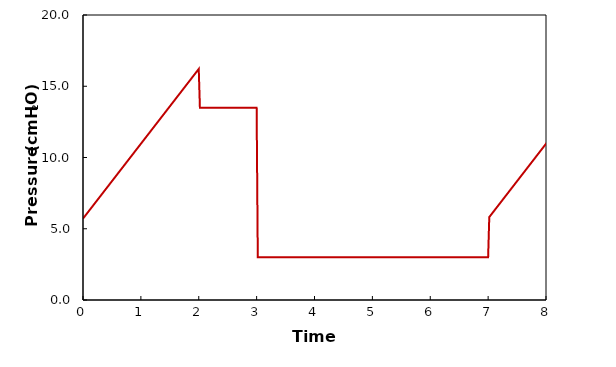
| Category | Poa |
|---|---|
| 0.0 | 5.712 |
| 0.02 | 5.818 |
| 0.04 | 5.922 |
| 0.06 | 6.028 |
| 0.08 | 6.132 |
| 0.1 | 6.238 |
| 0.12 | 6.342 |
| 0.14 | 6.448 |
| 0.16 | 6.552 |
| 0.18 | 6.658 |
| 0.2 | 6.762 |
| 0.22 | 6.868 |
| 0.24 | 6.972 |
| 0.26 | 7.078 |
| 0.28 | 7.182 |
| 0.3 | 7.288 |
| 0.32 | 7.392 |
| 0.34 | 7.498 |
| 0.36 | 7.602 |
| 0.38 | 7.708 |
| 0.4 | 7.812 |
| 0.42 | 7.917 |
| 0.44 | 8.022 |
| 0.46 | 8.127 |
| 0.48 | 8.232 |
| 0.5 | 8.337 |
| 0.52 | 8.442 |
| 0.54 | 8.548 |
| 0.56 | 8.652 |
| 0.58 | 8.758 |
| 0.6 | 8.862 |
| 0.62 | 8.968 |
| 0.64 | 9.072 |
| 0.66 | 9.178 |
| 0.68 | 9.282 |
| 0.7 | 9.388 |
| 0.72 | 9.492 |
| 0.74 | 9.598 |
| 0.76 | 9.702 |
| 0.78 | 9.808 |
| 0.8 | 9.912 |
| 0.82 | 10.017 |
| 0.84 | 10.122 |
| 0.86 | 10.228 |
| 0.88 | 10.332 |
| 0.9 | 10.438 |
| 0.92 | 10.542 |
| 0.94 | 10.647 |
| 0.96 | 10.752 |
| 0.98 | 10.857 |
| 1.0 | 10.962 |
| 1.02 | 11.067 |
| 1.04 | 11.172 |
| 1.06 | 11.278 |
| 1.08 | 11.382 |
| 1.1 | 11.487 |
| 1.12 | 11.592 |
| 1.14 | 11.697 |
| 1.16 | 11.802 |
| 1.18 | 11.907 |
| 1.2 | 12.012 |
| 1.22 | 12.118 |
| 1.24 | 12.222 |
| 1.26 | 12.327 |
| 1.28 | 12.432 |
| 1.3 | 12.538 |
| 1.32 | 12.642 |
| 1.34 | 12.747 |
| 1.36 | 12.852 |
| 1.38 | 12.958 |
| 1.4 | 13.062 |
| 1.42 | 13.167 |
| 1.44 | 13.272 |
| 1.46 | 13.377 |
| 1.48 | 13.482 |
| 1.5 | 13.587 |
| 1.52 | 13.692 |
| 1.54 | 13.798 |
| 1.56 | 13.902 |
| 1.58 | 14.007 |
| 1.6 | 14.112 |
| 1.62 | 14.218 |
| 1.64 | 14.322 |
| 1.66 | 14.427 |
| 1.68 | 14.532 |
| 1.7 | 14.637 |
| 1.72 | 14.742 |
| 1.74 | 14.847 |
| 1.76 | 14.952 |
| 1.78 | 15.058 |
| 1.8 | 15.162 |
| 1.82 | 15.267 |
| 1.84 | 15.372 |
| 1.86 | 15.478 |
| 1.88 | 15.582 |
| 1.9 | 15.687 |
| 1.92 | 15.792 |
| 1.94 | 15.897 |
| 1.96 | 16.002 |
| 1.98 | 16.107 |
| 2.0 | 16.212 |
| 2.02 | 13.5 |
| 2.04 | 13.5 |
| 2.06 | 13.5 |
| 2.08 | 13.5 |
| 2.1 | 13.5 |
| 2.12 | 13.5 |
| 2.14 | 13.5 |
| 2.16 | 13.5 |
| 2.18 | 13.5 |
| 2.2 | 13.5 |
| 2.22 | 13.5 |
| 2.24 | 13.5 |
| 2.26 | 13.5 |
| 2.28 | 13.5 |
| 2.3 | 13.5 |
| 2.32 | 13.5 |
| 2.34 | 13.5 |
| 2.36 | 13.5 |
| 2.38 | 13.5 |
| 2.4 | 13.5 |
| 2.42 | 13.5 |
| 2.44 | 13.5 |
| 2.46 | 13.5 |
| 2.48 | 13.5 |
| 2.5 | 13.5 |
| 2.52 | 13.5 |
| 2.54 | 13.5 |
| 2.56 | 13.5 |
| 2.58 | 13.5 |
| 2.6 | 13.5 |
| 2.62 | 13.5 |
| 2.64 | 13.5 |
| 2.66 | 13.5 |
| 2.68 | 13.5 |
| 2.7 | 13.5 |
| 2.72 | 13.5 |
| 2.74 | 13.5 |
| 2.76 | 13.5 |
| 2.78 | 13.5 |
| 2.8 | 13.5 |
| 2.82 | 13.5 |
| 2.84 | 13.5 |
| 2.86 | 13.5 |
| 2.88 | 13.5 |
| 2.9 | 13.5 |
| 2.92 | 13.5 |
| 2.94 | 13.5 |
| 2.96 | 13.5 |
| 2.98 | 13.5 |
| 3.0 | 13.5 |
| 3.02 | 3 |
| 3.04 | 3 |
| 3.06 | 3 |
| 3.08 | 3 |
| 3.1 | 3 |
| 3.12 | 3 |
| 3.14 | 3 |
| 3.16 | 3 |
| 3.18 | 3 |
| 3.2 | 3 |
| 3.22 | 3 |
| 3.24 | 3 |
| 3.26 | 3 |
| 3.28 | 3 |
| 3.3 | 3 |
| 3.32 | 3 |
| 3.34 | 3 |
| 3.36 | 3 |
| 3.38 | 3 |
| 3.4 | 3 |
| 3.42 | 3 |
| 3.44 | 3 |
| 3.46 | 3 |
| 3.48 | 3 |
| 3.5 | 3 |
| 3.52 | 3 |
| 3.54 | 3 |
| 3.56 | 3 |
| 3.58 | 3 |
| 3.6 | 3 |
| 3.62 | 3 |
| 3.64 | 3 |
| 3.66 | 3 |
| 3.68 | 3 |
| 3.7 | 3 |
| 3.72 | 3 |
| 3.74 | 3 |
| 3.76 | 3 |
| 3.78 | 3 |
| 3.8 | 3 |
| 3.82 | 3 |
| 3.84 | 3 |
| 3.86 | 3 |
| 3.88 | 3 |
| 3.9 | 3 |
| 3.92 | 3 |
| 3.94 | 3 |
| 3.96 | 3 |
| 3.98 | 3 |
| 4.0 | 3 |
| 4.02 | 3 |
| 4.04 | 3 |
| 4.06 | 3 |
| 4.08 | 3 |
| 4.1 | 3 |
| 4.12 | 3 |
| 4.14 | 3 |
| 4.16 | 3 |
| 4.18 | 3 |
| 4.2 | 3 |
| 4.22 | 3 |
| 4.24 | 3 |
| 4.26 | 3 |
| 4.28 | 3 |
| 4.3 | 3 |
| 4.32 | 3 |
| 4.34 | 3 |
| 4.36 | 3 |
| 4.38 | 3 |
| 4.4 | 3 |
| 4.42 | 3 |
| 4.44 | 3 |
| 4.46 | 3 |
| 4.48 | 3 |
| 4.5 | 3 |
| 4.52 | 3 |
| 4.54 | 3 |
| 4.56 | 3 |
| 4.58 | 3 |
| 4.6 | 3 |
| 4.62 | 3 |
| 4.64 | 3 |
| 4.66 | 3 |
| 4.68 | 3 |
| 4.7 | 3 |
| 4.72 | 3 |
| 4.74 | 3 |
| 4.76 | 3 |
| 4.78 | 3 |
| 4.8 | 3 |
| 4.82 | 3 |
| 4.84 | 3 |
| 4.86 | 3 |
| 4.88 | 3 |
| 4.9 | 3 |
| 4.92 | 3 |
| 4.94 | 3 |
| 4.96 | 3 |
| 4.98 | 3 |
| 5.0 | 3 |
| 5.02 | 3 |
| 5.04 | 3 |
| 5.06 | 3 |
| 5.08 | 3 |
| 5.1 | 3 |
| 5.12 | 3 |
| 5.14 | 3 |
| 5.16 | 3 |
| 5.18 | 3 |
| 5.2 | 3 |
| 5.22 | 3 |
| 5.24 | 3 |
| 5.26 | 3 |
| 5.28 | 3 |
| 5.3 | 3 |
| 5.32 | 3 |
| 5.34 | 3 |
| 5.36 | 3 |
| 5.38 | 3 |
| 5.4 | 3 |
| 5.42 | 3 |
| 5.44 | 3 |
| 5.46 | 3 |
| 5.48 | 3 |
| 5.5 | 3 |
| 5.52 | 3 |
| 5.54 | 3 |
| 5.56 | 3 |
| 5.58 | 3 |
| 5.6 | 3 |
| 5.62 | 3 |
| 5.64 | 3 |
| 5.66 | 3 |
| 5.68 | 3 |
| 5.7 | 3 |
| 5.72 | 3 |
| 5.74 | 3 |
| 5.76 | 3 |
| 5.78 | 3 |
| 5.8 | 3 |
| 5.82 | 3 |
| 5.84 | 3 |
| 5.86 | 3 |
| 5.88 | 3 |
| 5.9 | 3 |
| 5.92 | 3 |
| 5.94 | 3 |
| 5.96 | 3 |
| 5.98 | 3 |
| 6.0 | 3 |
| 6.02 | 3 |
| 6.04 | 3 |
| 6.06 | 3 |
| 6.08 | 3 |
| 6.1 | 3 |
| 6.12 | 3 |
| 6.14 | 3 |
| 6.16 | 3 |
| 6.18 | 3 |
| 6.2 | 3 |
| 6.22 | 3 |
| 6.24 | 3 |
| 6.26 | 3 |
| 6.28 | 3 |
| 6.3 | 3 |
| 6.32 | 3 |
| 6.34 | 3 |
| 6.36 | 3 |
| 6.38 | 3 |
| 6.4 | 3 |
| 6.42 | 3 |
| 6.44 | 3 |
| 6.46 | 3 |
| 6.48 | 3 |
| 6.5 | 3 |
| 6.52 | 3 |
| 6.54 | 3 |
| 6.56 | 3 |
| 6.58 | 3 |
| 6.6 | 3 |
| 6.62 | 3 |
| 6.64 | 3 |
| 6.66 | 3 |
| 6.68 | 3 |
| 6.7 | 3 |
| 6.72 | 3 |
| 6.74 | 3 |
| 6.76 | 3 |
| 6.78 | 3 |
| 6.8 | 3 |
| 6.82 | 3 |
| 6.84 | 3 |
| 6.86 | 3 |
| 6.88 | 3 |
| 6.9 | 3 |
| 6.92 | 3 |
| 6.94 | 3 |
| 6.96 | 3 |
| 6.98 | 3 |
| 7.0 | 3 |
| 7.02 | 5.819 |
| 7.04 | 5.924 |
| 7.06 | 6.029 |
| 7.08 | 6.134 |
| 7.1 | 6.239 |
| 7.12 | 6.344 |
| 7.14 | 6.449 |
| 7.16000000000001 | 6.554 |
| 7.18 | 6.659 |
| 7.2 | 6.764 |
| 7.22 | 6.869 |
| 7.24000000000001 | 6.974 |
| 7.26 | 7.079 |
| 7.28 | 7.184 |
| 7.3 | 7.289 |
| 7.32000000000001 | 7.394 |
| 7.34 | 7.499 |
| 7.36 | 7.604 |
| 7.38 | 7.709 |
| 7.40000000000001 | 7.814 |
| 7.42 | 7.919 |
| 7.44 | 8.024 |
| 7.46 | 8.129 |
| 7.48000000000001 | 8.234 |
| 7.5 | 8.339 |
| 7.52 | 8.444 |
| 7.54 | 8.549 |
| 7.56000000000001 | 8.654 |
| 7.58 | 8.759 |
| 7.6 | 8.864 |
| 7.62000000000001 | 8.969 |
| 7.64000000000001 | 9.074 |
| 7.66000000000001 | 9.179 |
| 7.68 | 9.284 |
| 7.70000000000001 | 9.389 |
| 7.72000000000001 | 9.494 |
| 7.74000000000001 | 9.599 |
| 7.76 | 9.704 |
| 7.78000000000001 | 9.809 |
| 7.80000000000001 | 9.914 |
| 7.82000000000001 | 10.019 |
| 7.84 | 10.124 |
| 7.86000000000001 | 10.229 |
| 7.88000000000001 | 10.334 |
| 7.90000000000001 | 10.439 |
| 7.92 | 10.544 |
| 7.94000000000001 | 10.649 |
| 7.96000000000001 | 10.754 |
| 7.98000000000001 | 10.859 |
| 8.0 | 10.964 |
| 8.02000000000001 | 11.069 |
| 8.04000000000001 | 11.174 |
| 8.06000000000001 | 11.279 |
| 8.08 | 11.384 |
| 8.10000000000001 | 11.489 |
| 8.12000000000001 | 11.594 |
| 8.14000000000001 | 11.699 |
| 8.16000000000001 | 11.804 |
| 8.18000000000001 | 11.909 |
| 8.20000000000001 | 12.014 |
| 8.22000000000001 | 12.119 |
| 8.24000000000001 | 12.224 |
| 8.26000000000001 | 12.329 |
| 8.28000000000001 | 12.434 |
| 8.30000000000001 | 12.539 |
| 8.32000000000001 | 12.644 |
| 8.34000000000001 | 12.749 |
| 8.36000000000001 | 12.854 |
| 8.38000000000001 | 12.959 |
| 8.40000000000001 | 13.064 |
| 8.42000000000001 | 13.169 |
| 8.44000000000001 | 13.274 |
| 8.46000000000001 | 13.379 |
| 8.48000000000001 | 13.484 |
| 8.50000000000001 | 13.589 |
| 8.52000000000001 | 13.694 |
| 8.54000000000001 | 13.799 |
| 8.56000000000001 | 13.904 |
| 8.58000000000001 | 14.009 |
| 8.60000000000001 | 14.114 |
| 8.62000000000001 | 14.219 |
| 8.64000000000001 | 14.324 |
| 8.66000000000001 | 14.429 |
| 8.68000000000001 | 14.534 |
| 8.70000000000001 | 14.639 |
| 8.72000000000001 | 14.744 |
| 8.74000000000001 | 14.849 |
| 8.76000000000001 | 14.954 |
| 8.78000000000001 | 15.059 |
| 8.80000000000001 | 15.164 |
| 8.82000000000001 | 15.269 |
| 8.84000000000001 | 15.374 |
| 8.86000000000001 | 15.479 |
| 8.88000000000001 | 15.584 |
| 8.90000000000001 | 15.689 |
| 8.92000000000001 | 15.794 |
| 8.94000000000001 | 15.899 |
| 8.96000000000001 | 16.004 |
| 8.98000000000001 | 16.109 |
| 9.00000000000001 | 16.214 |